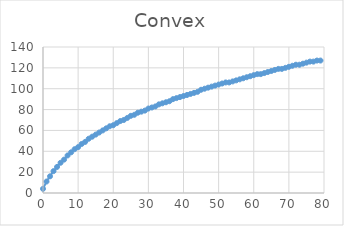
| Category | Series 0 |
|---|---|
| 0.0 | 4 |
| 1.0 | 11 |
| 2.0 | 16 |
| 3.0 | 21 |
| 4.0 | 25 |
| 5.0 | 29 |
| 6.0 | 32 |
| 7.0 | 36 |
| 8.0 | 39 |
| 9.0 | 42 |
| 10.0 | 44 |
| 11.0 | 47 |
| 12.0 | 49 |
| 13.0 | 52 |
| 14.0 | 54 |
| 15.0 | 56 |
| 16.0 | 58 |
| 17.0 | 60 |
| 18.0 | 62 |
| 19.0 | 64 |
| 20.0 | 65 |
| 21.0 | 67 |
| 22.0 | 69 |
| 23.0 | 70 |
| 24.0 | 72 |
| 25.0 | 74 |
| 26.0 | 75 |
| 27.0 | 77 |
| 28.0 | 78 |
| 29.0 | 79 |
| 30.0 | 81 |
| 31.0 | 82 |
| 32.0 | 83 |
| 33.0 | 85 |
| 34.0 | 86 |
| 35.0 | 87 |
| 36.0 | 88 |
| 37.0 | 90 |
| 38.0 | 91 |
| 39.0 | 92 |
| 40.0 | 93 |
| 41.0 | 94 |
| 42.0 | 95 |
| 43.0 | 96 |
| 44.0 | 97 |
| 45.0 | 99 |
| 46.0 | 100 |
| 47.0 | 101 |
| 48.0 | 102 |
| 49.0 | 103 |
| 50.0 | 104 |
| 51.0 | 105 |
| 52.0 | 106 |
| 53.0 | 106 |
| 54.0 | 107 |
| 55.0 | 108 |
| 56.0 | 109 |
| 57.0 | 110 |
| 58.0 | 111 |
| 59.0 | 112 |
| 60.0 | 113 |
| 61.0 | 114 |
| 62.0 | 114 |
| 63.0 | 115 |
| 64.0 | 116 |
| 65.0 | 117 |
| 66.0 | 118 |
| 67.0 | 119 |
| 68.0 | 119 |
| 69.0 | 120 |
| 70.0 | 121 |
| 71.0 | 122 |
| 72.0 | 123 |
| 73.0 | 123 |
| 74.0 | 124 |
| 75.0 | 125 |
| 76.0 | 126 |
| 77.0 | 126 |
| 78.0 | 127 |
| 79.0 | 127 |